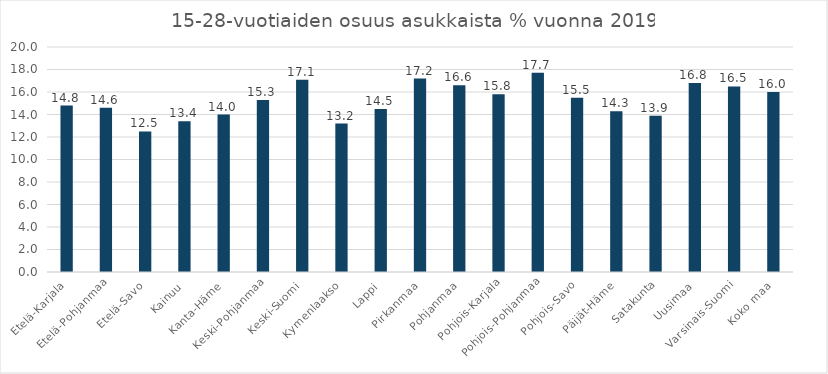
| Category | 15-28-vuotiaiden osuus asukkaista % 2019 |
|---|---|
| Etelä-Karjala | 14.8 |
| Etelä-Pohjanmaa | 14.6 |
| Etelä-Savo | 12.5 |
| Kainuu | 13.4 |
| Kanta-Häme | 14 |
| Keski-Pohjanmaa | 15.3 |
| Keski-Suomi | 17.1 |
| Kymenlaakso | 13.2 |
| Lappi | 14.5 |
| Pirkanmaa | 17.2 |
| Pohjanmaa | 16.6 |
| Pohjois-Karjala | 15.8 |
| Pohjois-Pohjanmaa | 17.7 |
| Pohjois-Savo | 15.5 |
| Päijät-Häme | 14.3 |
| Satakunta | 13.9 |
| Uusimaa | 16.8 |
| Varsinais-Suomi | 16.5 |
| Koko maa | 16 |